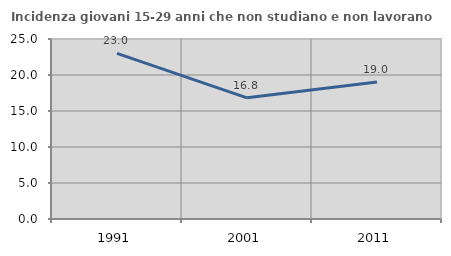
| Category | Incidenza giovani 15-29 anni che non studiano e non lavorano  |
|---|---|
| 1991.0 | 23.009 |
| 2001.0 | 16.826 |
| 2011.0 | 19.013 |